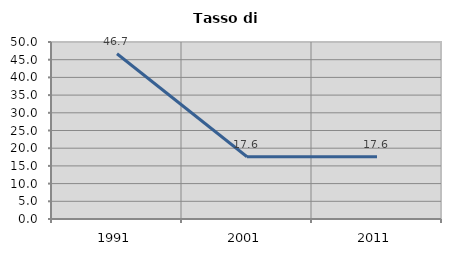
| Category | Tasso di disoccupazione   |
|---|---|
| 1991.0 | 46.694 |
| 2001.0 | 17.593 |
| 2011.0 | 17.584 |